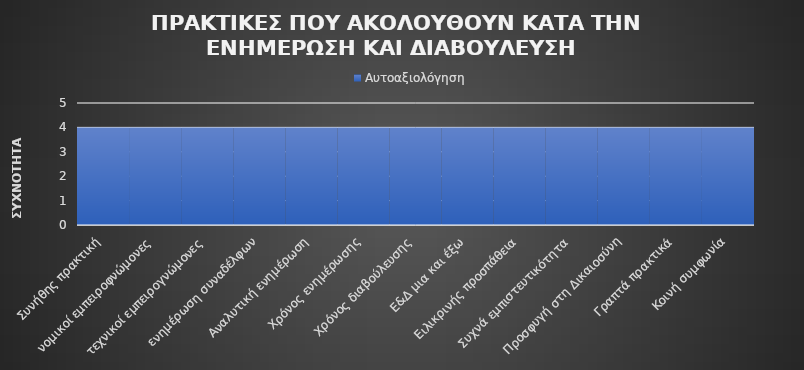
| Category | Αυτοαξιολόγηση |
|---|---|
| Συνήθης πρακτική | 4 |
| νομικοί εμπειροφνώμονες | 4 |
| τεχνικοί εμπειρογνώμονες | 4 |
| ενημέρωση συναδέλφων | 4 |
| Αναλυτική ενημέρωση | 4 |
| Χρόνος ενημέρωσης | 4 |
| Χρόνος διαβούλευσης | 4 |
| Ε&Δ μια και έξω | 4 |
| Ειλικρινής προσπάθεια | 4 |
| Συχνά εμπιστευτικότητα | 4 |
| Προσφυγή στη Δικαιοσύνη | 4 |
| Γραπτά πρακτικά | 4 |
| Κοινή συμφωνία | 4 |